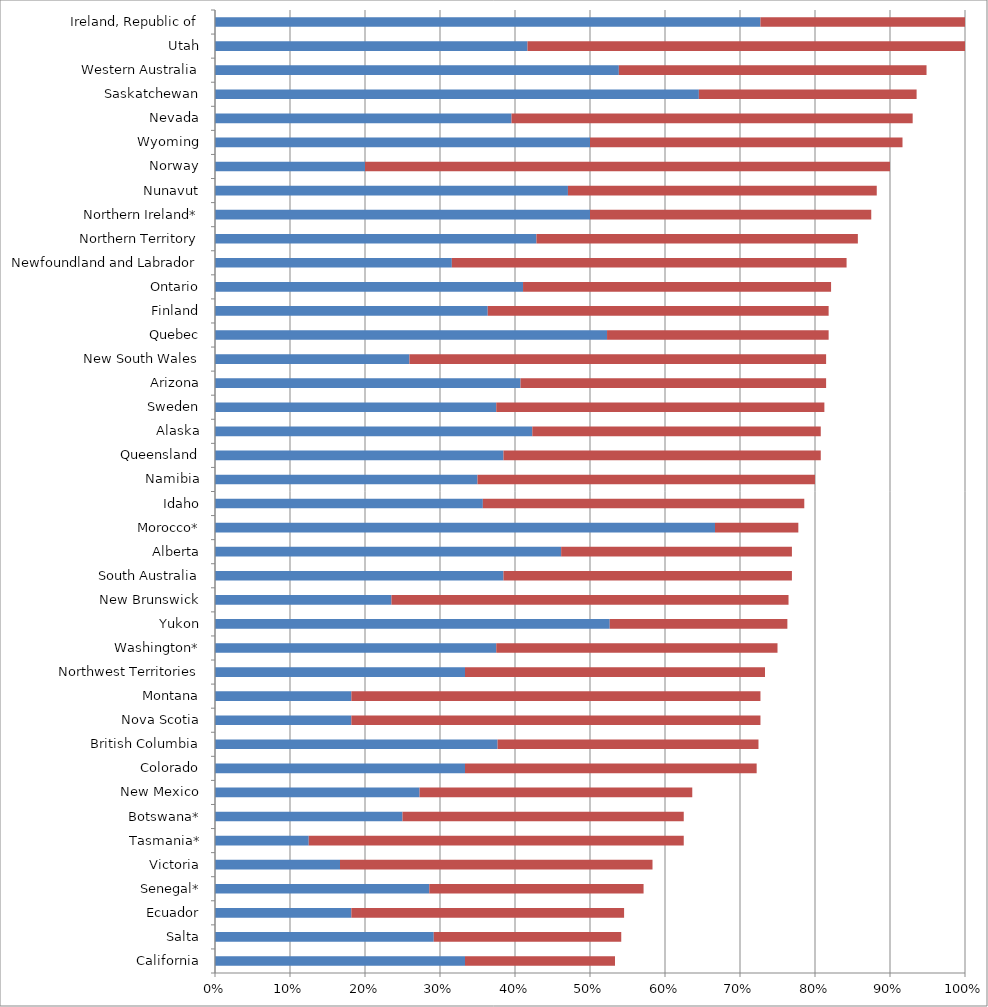
| Category | Series 0 | Series 1 |
|---|---|---|
| California | 0.333 | 0.2 |
| Salta | 0.292 | 0.25 |
| Ecuador | 0.182 | 0.364 |
| Senegal* | 0.286 | 0.286 |
| Victoria | 0.167 | 0.417 |
| Tasmania* | 0.125 | 0.5 |
| Botswana* | 0.25 | 0.375 |
| New Mexico | 0.273 | 0.364 |
| Colorado | 0.333 | 0.389 |
| British Columbia | 0.377 | 0.348 |
| Nova Scotia | 0.182 | 0.545 |
| Montana | 0.182 | 0.545 |
| Northwest Territories | 0.333 | 0.4 |
| Washington* | 0.375 | 0.375 |
| Yukon | 0.526 | 0.237 |
| New Brunswick | 0.235 | 0.529 |
| South Australia | 0.385 | 0.385 |
| Alberta | 0.462 | 0.308 |
| Morocco* | 0.667 | 0.111 |
| Idaho | 0.357 | 0.429 |
| Namibia | 0.35 | 0.45 |
| Queensland | 0.385 | 0.423 |
| Alaska | 0.423 | 0.385 |
| Sweden | 0.375 | 0.438 |
| Arizona | 0.407 | 0.407 |
| New South Wales | 0.259 | 0.556 |
| Quebec | 0.523 | 0.295 |
| Finland | 0.364 | 0.455 |
| Ontario | 0.411 | 0.411 |
| Newfoundland and Labrador | 0.316 | 0.526 |
| Northern Territory | 0.429 | 0.429 |
| Northern Ireland* | 0.5 | 0.375 |
| Nunavut | 0.471 | 0.412 |
| Norway | 0.2 | 0.7 |
| Wyoming | 0.5 | 0.417 |
| Nevada | 0.395 | 0.535 |
| Saskatchewan | 0.645 | 0.29 |
| Western Australia | 0.538 | 0.41 |
| Utah | 0.417 | 0.583 |
| Ireland, Republic of | 0.727 | 0.273 |